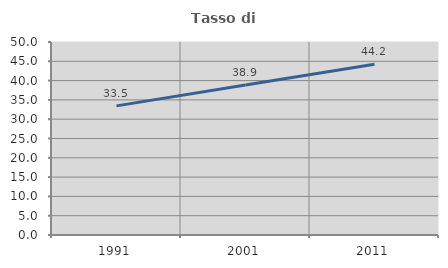
| Category | Tasso di occupazione   |
|---|---|
| 1991.0 | 33.45 |
| 2001.0 | 38.88 |
| 2011.0 | 44.234 |